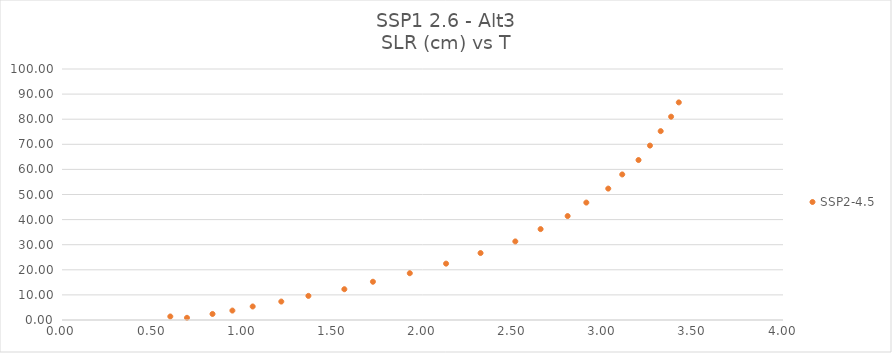
| Category | SSP2-4.5 |
|---|---|
| 0.693400617 | 0.87 |
| 0.600872844 | 1.399 |
| 0.835003234 | 2.407 |
| 0.945258389 | 3.755 |
| 1.057970477 | 5.386 |
| 1.216609042 | 7.344 |
| 1.366998793 | 9.606 |
| 1.566434093 | 12.264 |
| 1.725029717 | 15.241 |
| 1.929548264 | 18.638 |
| 2.130780438 | 22.455 |
| 2.322094238 | 26.676 |
| 2.514951438 | 31.308 |
| 2.655222105 | 36.215 |
| 2.805223779 | 41.418 |
| 2.908880511 | 46.783 |
| 3.030529346 | 52.35 |
| 3.108116719 | 57.99 |
| 3.198493144 | 63.73 |
| 3.262035587 | 69.487 |
| 3.321438687 | 75.246 |
| 3.379200107 | 80.996 |
| 3.421851642 | 86.692 |